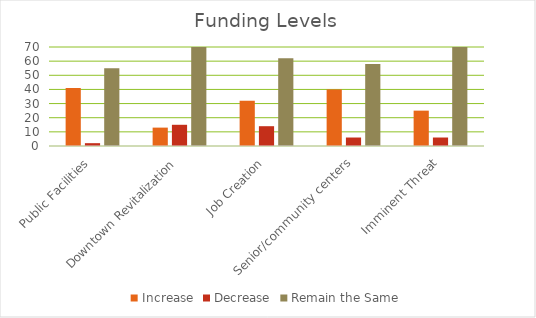
| Category | Increase | Decrease | Remain the Same |
|---|---|---|---|
| Public Facilities | 41 | 2 | 55 |
| Downtown Revitalization | 13 | 15 | 75 |
| Job Creation | 32 | 14 | 62 |
| Senior/community centers | 40 | 6 | 58 |
| Imminent Threat | 25 | 6 | 70 |